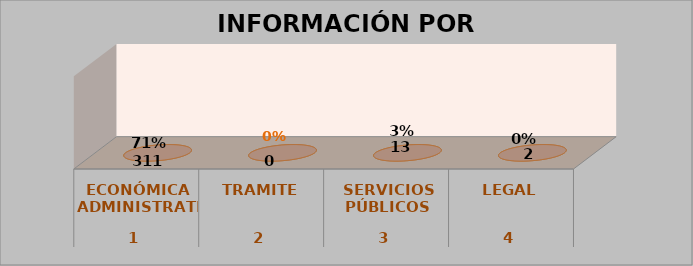
| Category | Series 0 | Series 1 | Series 2 | Series 3 |
|---|---|---|---|---|
| 0 |  |  | 0 | 0 |
| 1 |  |  | 0 | 0 |
| 2 |  |  | 0 | 0 |
| 3 |  |  | 0 | 0 |